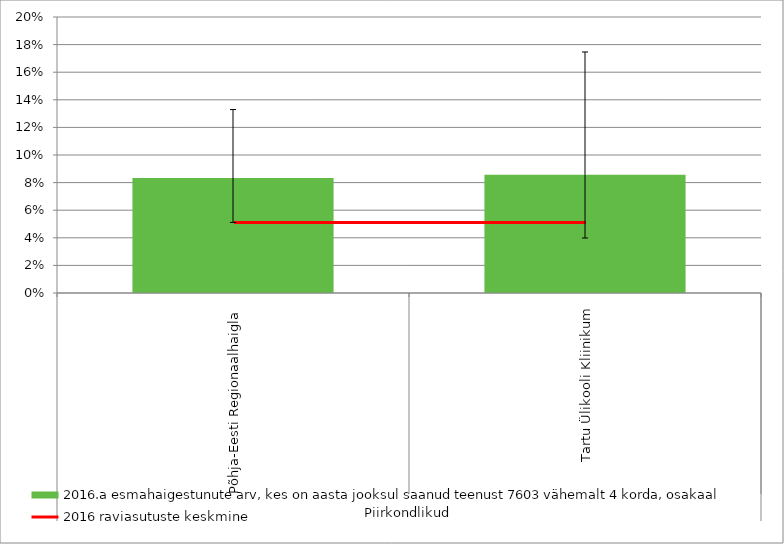
| Category | 2016.a esmahaigestunute arv, kes on aasta jooksul saanud teenust 7603 vähemalt 4 korda, osakaal |
|---|---|
| 0 | 0.083 |
| 1 | 0.086 |